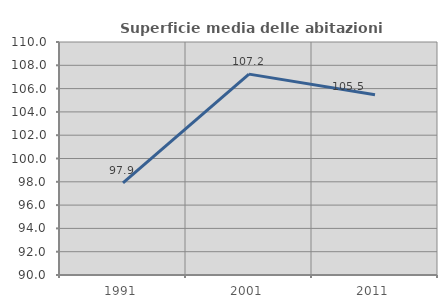
| Category | Superficie media delle abitazioni occupate |
|---|---|
| 1991.0 | 97.902 |
| 2001.0 | 107.243 |
| 2011.0 | 105.471 |